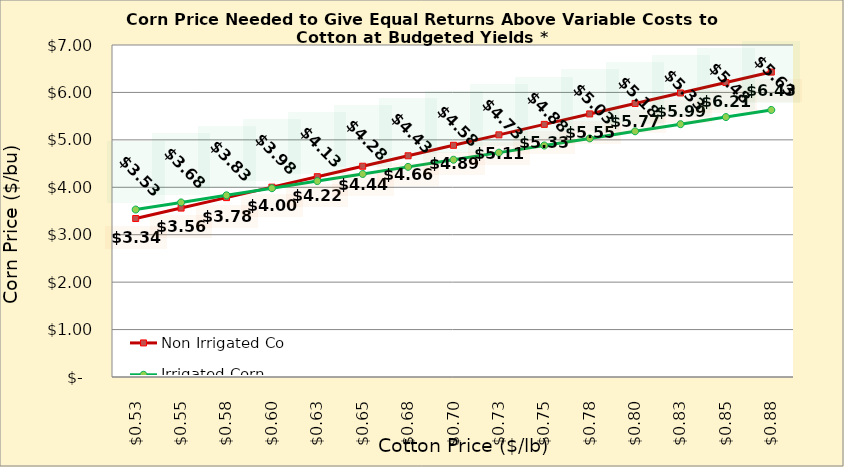
| Category | Non Irrigated Corn | Irrigated Corn |
|---|---|---|
| 0.5249999999999998 | 3.341 | 3.531 |
| 0.5499999999999998 | 3.562 | 3.681 |
| 0.5749999999999998 | 3.782 | 3.831 |
| 0.5999999999999999 | 4.003 | 3.981 |
| 0.6249999999999999 | 4.223 | 4.131 |
| 0.6499999999999999 | 4.444 | 4.281 |
| 0.6749999999999999 | 4.665 | 4.431 |
| 0.7 | 4.885 | 4.581 |
| 0.725 | 5.106 | 4.731 |
| 0.75 | 5.326 | 4.881 |
| 0.775 | 5.547 | 5.031 |
| 0.8 | 5.767 | 5.181 |
| 0.8250000000000001 | 5.988 | 5.331 |
| 0.8500000000000001 | 6.209 | 5.481 |
| 0.8750000000000001 | 6.429 | 5.631 |